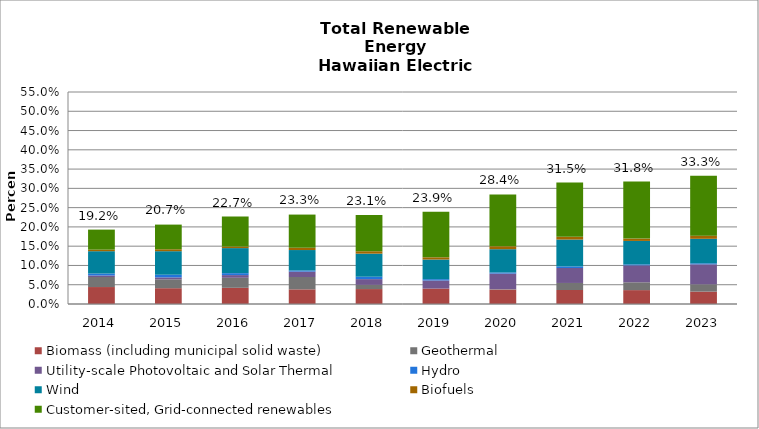
| Category | Biomass (including municipal solid waste) | Geothermal | Utility-scale Photovoltaic and Solar Thermal | Hydro | Wind | Biofuels | Customer-sited, Grid-connected renewables |
|---|---|---|---|---|---|---|---|
| 2014.0 | 0.044 | 0.026 | 0.004 | 0.005 | 0.058 | 0.004 | 0.052 |
| 2015.0 | 0.041 | 0.023 | 0.005 | 0.007 | 0.061 | 0.005 | 0.064 |
| 2016.0 | 0.042 | 0.026 | 0.007 | 0.005 | 0.065 | 0.004 | 0.078 |
| 2017.0 | 0.038 | 0.032 | 0.014 | 0.003 | 0.053 | 0.006 | 0.086 |
| 2018.0 | 0.039 | 0.011 | 0.015 | 0.006 | 0.06 | 0.006 | 0.094 |
| 2019.0 | 0.04 | 0 | 0.021 | 0.003 | 0.051 | 0.006 | 0.118 |
| 2020.0 | 0.037 | 0.001 | 0.04 | 0.003 | 0.06 | 0.008 | 0.135 |
| 2021.0 | 0.036 | 0.018 | 0.039 | 0.004 | 0.07 | 0.007 | 0.141 |
| 2022.0 | 0.036 | 0.02 | 0.044 | 0.003 | 0.061 | 0.006 | 0.148 |
| 2023.0 | 0.032 | 0.019 | 0.052 | 0.003 | 0.064 | 0.008 | 0.156 |